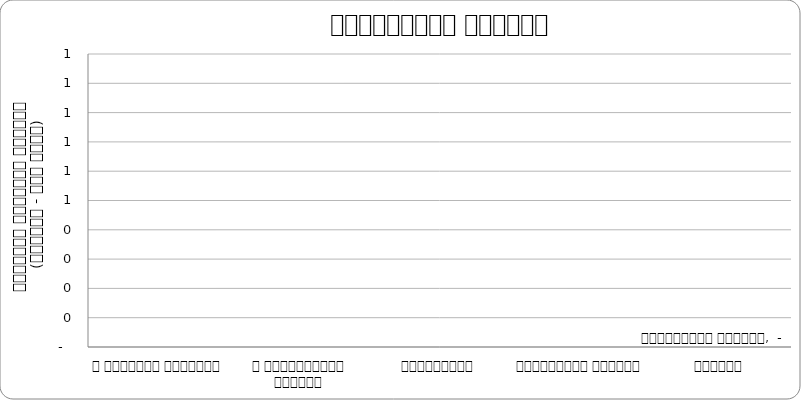
| Category | प्राकृतिक प्रकोप |
|---|---|
| द हिमालयन टाइम्स् | 0 |
| द काठमाण्डौं पोस्ट् | 0 |
| कान्तिपुर | 0 |
| अन्नपूर्ण पोस्ट् | 0 |
| नागरिक | 0 |